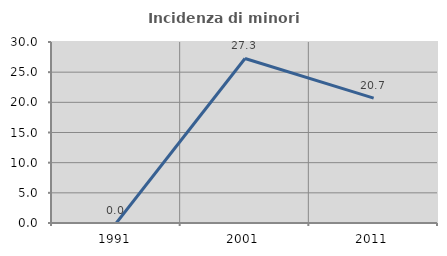
| Category | Incidenza di minori stranieri |
|---|---|
| 1991.0 | 0 |
| 2001.0 | 27.273 |
| 2011.0 | 20.69 |